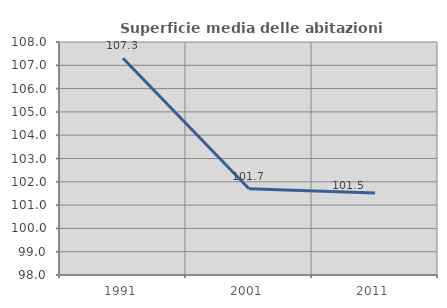
| Category | Superficie media delle abitazioni occupate |
|---|---|
| 1991.0 | 107.3 |
| 2001.0 | 101.698 |
| 2011.0 | 101.515 |